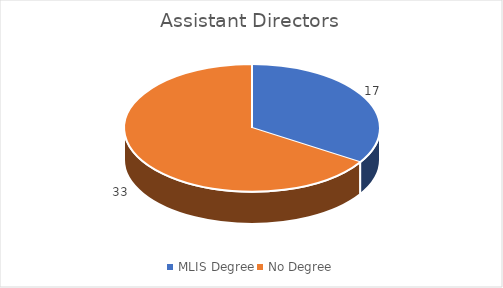
| Category | Series 0 |
|---|---|
| MLIS Degree | 17 |
| No Degree | 33 |